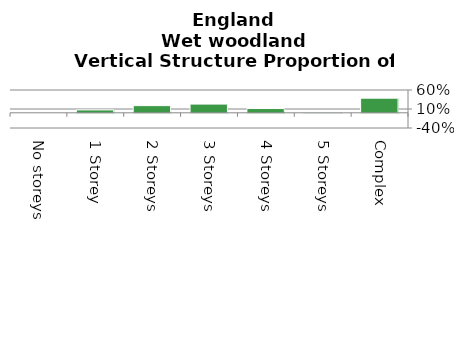
| Category | Wet woodland |
|---|---|
| No storeys | 0 |
| 1 Storey | 0.075 |
| 2 Storeys | 0.188 |
| 3 Storeys | 0.229 |
| 4 Storeys | 0.112 |
| 5 Storeys | 0.01 |
| Complex | 0.385 |